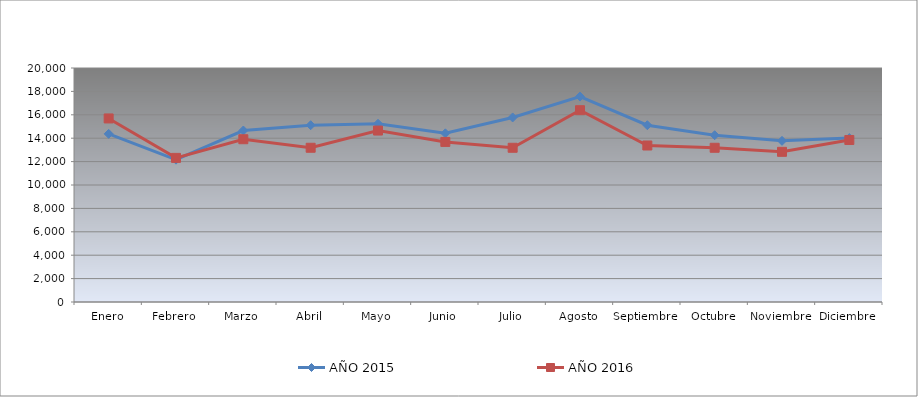
| Category | AÑO 2015 | AÑO 2016 |
|---|---|---|
| Enero | 14370.465 | 15688.138 |
| Febrero | 12164.62 | 12318.763 |
| Marzo | 14657.113 | 13912.58 |
| Abril | 15111.718 | 13183.411 |
| Mayo | 15233.768 | 14653.865 |
| Junio | 14416.373 | 13681.273 |
| Julio | 15773.472 | 13182.31 |
| Agosto | 17561.102 | 16394.176 |
| Septiembre | 15111.718 | 13375.066 |
| Octubre | 14255.134 | 13181.209 |
| Noviembre | 13773.655 | 12835.349 |
| Diciembre | 14011.035 | 13848.695 |